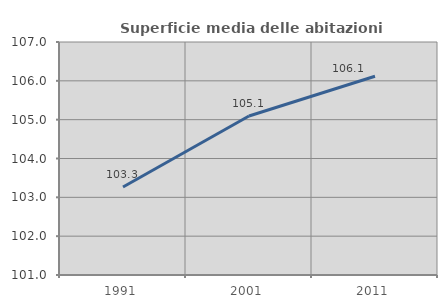
| Category | Superficie media delle abitazioni occupate |
|---|---|
| 1991.0 | 103.267 |
| 2001.0 | 105.094 |
| 2011.0 | 106.118 |